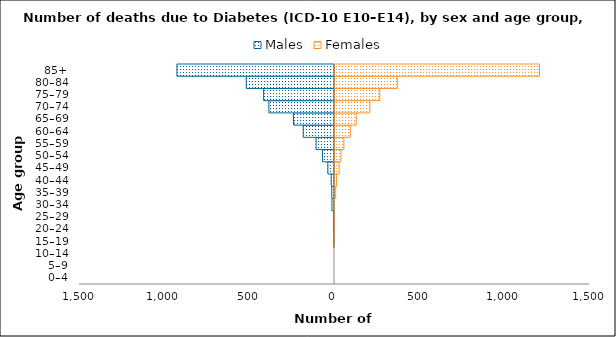
| Category | Males | Females |
|---|---|---|
| 0–4 | 0 | 0 |
| 5–9 | 0 | 0 |
| 10–14 | 0 | 0 |
| 15–19 | -3 | 1 |
| 20–24 | -4 | 3 |
| 25–29 | -4 | 3 |
| 30–34 | -15 | 2 |
| 35–39 | -16 | 10 |
| 40–44 | -19 | 15 |
| 45–49 | -39 | 30 |
| 50–54 | -71 | 41 |
| 55–59 | -108 | 58 |
| 60–64 | -184 | 96 |
| 65–69 | -241 | 131 |
| 70–74 | -386 | 211 |
| 75–79 | -417 | 269 |
| 80–84 | -519 | 372 |
| 85+ | -927 | 1209 |